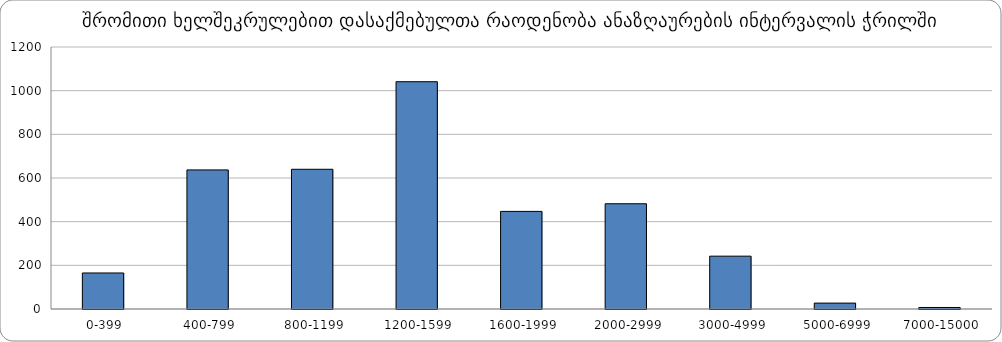
| Category | ჯამი |
|---|---|
|  0-399 | 165 |
|  400-799 | 637 |
|  800-1199 | 640 |
|  1200-1599 | 1041 |
|  1600-1999 | 447 |
|  2000-2999 | 482 |
|  3000-4999 | 242 |
|  5000-6999 | 27 |
|  7000-15000 | 7 |